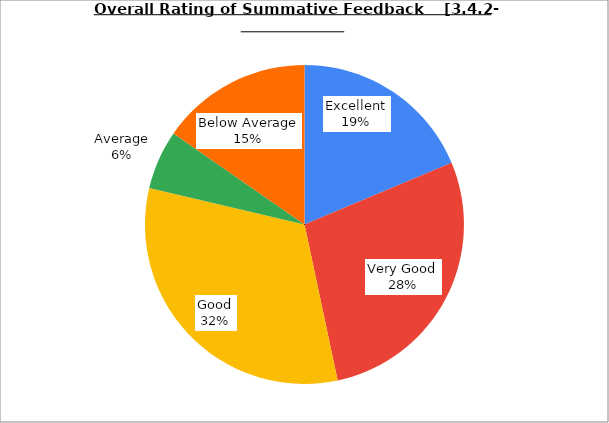
| Category | Series 0 |
|---|---|
| Excellent | 18.667 |
| Very Good | 28 |
| Good | 32 |
| Average | 6 |
| Below Average | 15.333 |